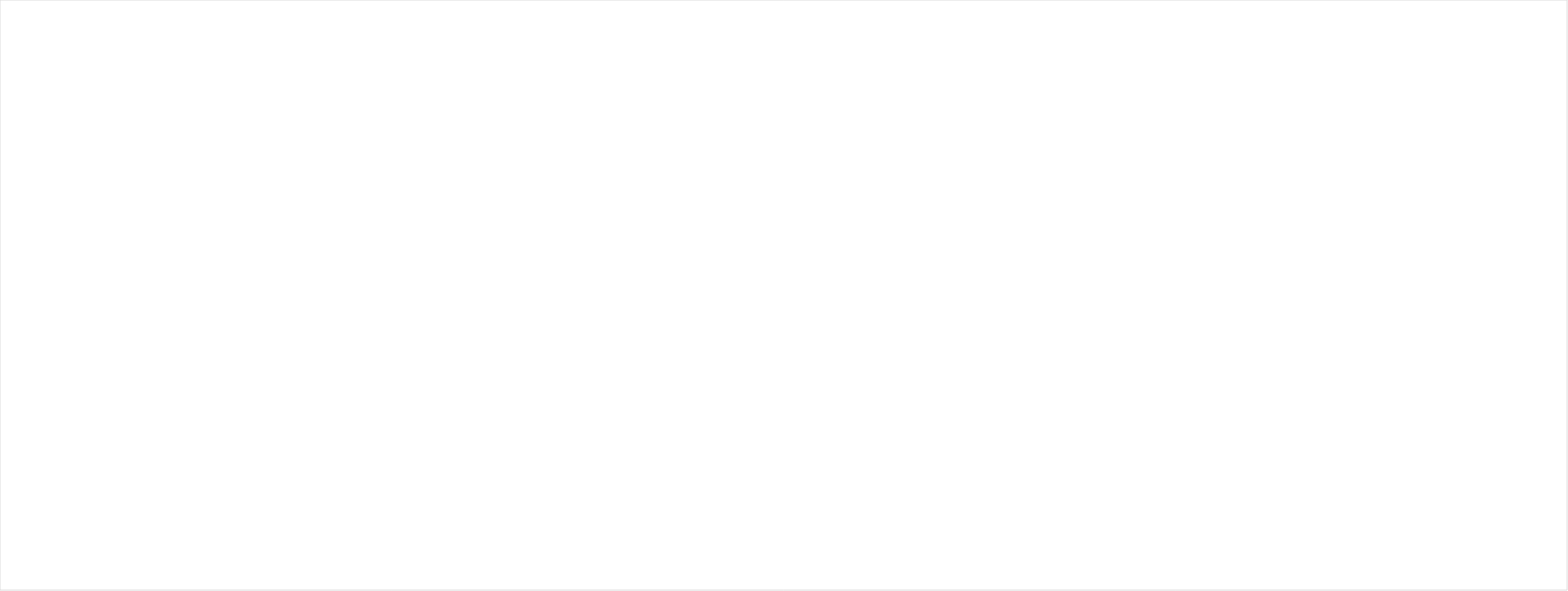
| Category | Series 0 |
|---|---|
| All teachers have access to world-class training and professional development at every stage of their career | 0 |
| Quality subject leadership | 0 |
| Music is represented at every level within the school’s leadership structure | 0 |
| Named designated music lead at school and/or academy trust level | 0 |
| Time | 0 |
| Resources | 0 |
| Access to regular training to develop effective programmes of study | 0 |
| Time to plan and deliver the wider musical offer | 0 |
| Support where needed | 0 |
| Ensure a suitable budget for music | 0 |
| Involves Governors/SLT in fundraising bids and identifying income sources; e.g. charging and remissions, Charitable and other funding (local charities, UK Music Sound Foundation, Parents’ Association) | 0 |
| Allocates income the school collects for music (lesson fees, instrument hire charges, parental donations, concert ticket income, sale of refreshments at concerts) is attributed to the music budget | 0 |
| Allocates suitable accomodation/space for music; music tuition (specialist classroom, in class), Choirs/ensembles (hall, classrooms), instrumental/vocal tuition (practice rooms, dedicated space, library) | 0 |
| Ensures resources and equipment are available for music (e.g. school owned, hires or leases, borrowed, books, references, printed music, subscriptions etc)  | 0 |
| Ensures resources are cleaned, maintained, repaired and renewed and costs are funded, including consumables (e.g. reeds for clarinets) | 0 |
| Interrogate the accessibility and inclusivity of the music curriculum | 0 |
| Show how the school's music provision is improving over time | 0 |
| Show how the school's music provision supports pupil progression | 0 |